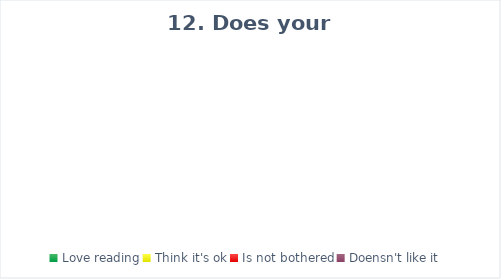
| Category | Series 0 |
|---|---|
| Love reading | 0 |
| Think it's ok | 0 |
| Is not bothered | 0 |
| Doensn't like it | 0 |